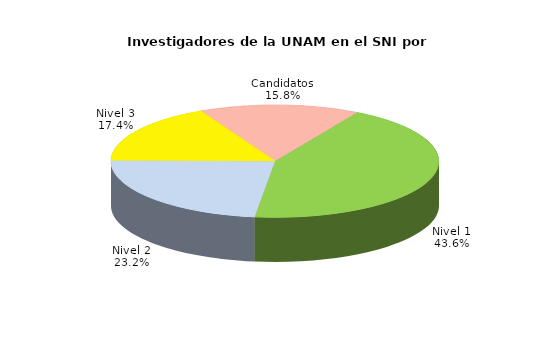
| Category | Series 0 |
|---|---|
| Nivel 1 | 2157 |
| Nivel 2 | 1146 |
| Nivel 3 | 858 |
| Candidatos | 782 |